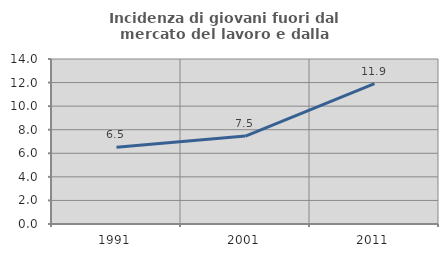
| Category | Incidenza di giovani fuori dal mercato del lavoro e dalla formazione  |
|---|---|
| 1991.0 | 6.522 |
| 2001.0 | 7.463 |
| 2011.0 | 11.905 |